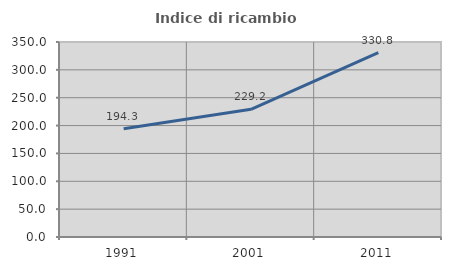
| Category | Indice di ricambio occupazionale  |
|---|---|
| 1991.0 | 194.251 |
| 2001.0 | 229.24 |
| 2011.0 | 330.827 |